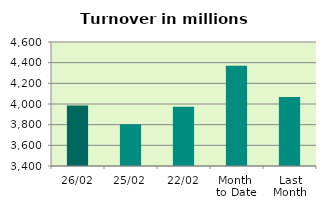
| Category | Series 0 |
|---|---|
| 26/02 | 3986.585 |
| 25/02 | 3804.252 |
| 22/02 | 3972.825 |
| Month 
to Date | 4370.272 |
| Last
Month | 4067.116 |